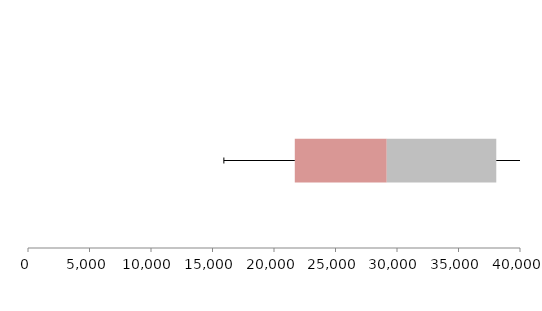
| Category | Series 1 | Series 2 | Series 3 |
|---|---|---|---|
| 0 | 21690.131 | 7476.906 | 8904.29 |